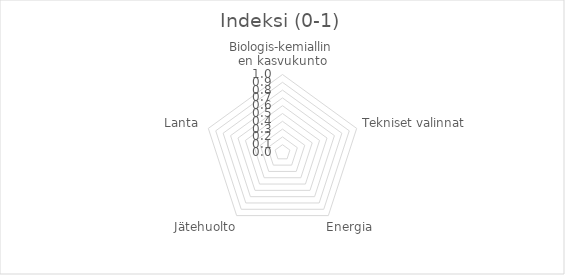
| Category | Indeksi |
|---|---|
| Biologis-kemiallinen kasvukunto | 0 |
| Tekniset valinnat | 0 |
| Energia | 0 |
| Jätehuolto | 0 |
| Lanta | 0 |